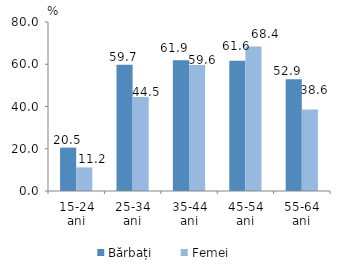
| Category | Bărbați | Femei |
|---|---|---|
| 15-24 ani | 20.54 | 11.177 |
| 25-34 ani | 59.714 | 44.508 |
| 35-44 ani | 61.882 | 59.603 |
| 45-54 ani | 61.615 | 68.424 |
| 55-64 ani | 52.941 | 38.555 |